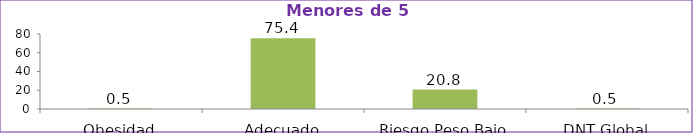
| Category | Series 0 |
|---|---|
| Obesidad | 0.5 |
| Adecuado | 75.4 |
| Riesgo Peso Bajo | 20.8 |
| DNT Global | 0.5 |